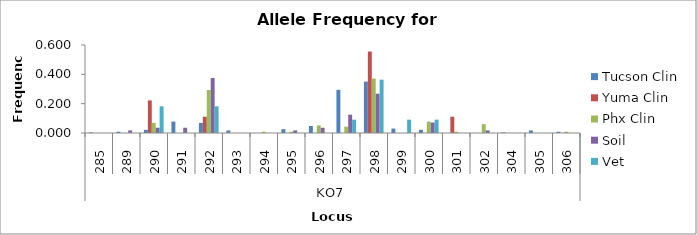
| Category | Tucson Clin | Yuma Clin | Phx Clin | Soil | Vet |
|---|---|---|---|---|---|
| 0 | 0.004 | 0 | 0 | 0 | 0 |
| 1 | 0.009 | 0 | 0 | 0.018 | 0 |
| 2 | 0.022 | 0.222 | 0.069 | 0.036 | 0.182 |
| 3 | 0.078 | 0 | 0 | 0.036 | 0 |
| 4 | 0.069 | 0.111 | 0.293 | 0.375 | 0.182 |
| 5 | 0.017 | 0 | 0 | 0 | 0 |
| 6 | 0 | 0 | 0.009 | 0 | 0 |
| 7 | 0.026 | 0 | 0.009 | 0.018 | 0 |
| 8 | 0.048 | 0 | 0.052 | 0.036 | 0 |
| 9 | 0.294 | 0 | 0.043 | 0.125 | 0.091 |
| 10 | 0.351 | 0.556 | 0.371 | 0.268 | 0.364 |
| 11 | 0.03 | 0 | 0 | 0 | 0.091 |
| 12 | 0.022 | 0 | 0.078 | 0.071 | 0.091 |
| 13 | 0 | 0.111 | 0.009 | 0 | 0 |
| 14 | 0 | 0 | 0.06 | 0.018 | 0 |
| 15 | 0.004 | 0 | 0 | 0 | 0 |
| 16 | 0.017 | 0 | 0 | 0 | 0 |
| 17 | 0.009 | 0 | 0.009 | 0 | 0 |